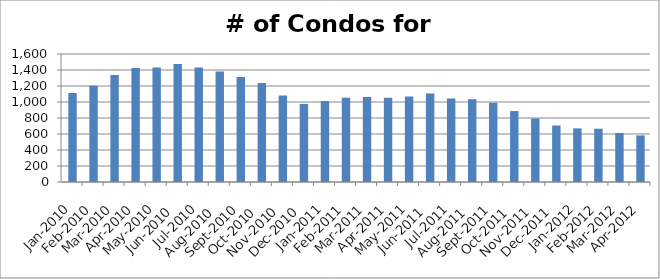
| Category | Series 0 |
|---|---|
| 2010-01-01 | 1111 |
| 2010-02-01 | 1203 |
| 2010-03-01 | 1337 |
| 2010-04-01 | 1425 |
| 2010-05-01 | 1431 |
| 2010-06-01 | 1475 |
| 2010-07-01 | 1432 |
| 2010-08-01 | 1380 |
| 2010-09-01 | 1314 |
| 2010-10-01 | 1236 |
| 2010-11-01 | 1081 |
| 2010-12-01 | 976 |
| 2011-01-01 | 1012 |
| 2011-02-01 | 1054 |
| 2011-03-01 | 1064 |
| 2011-04-01 | 1053 |
| 2011-05-01 | 1068 |
| 2011-06-01 | 1107 |
| 2011-07-01 | 1044 |
| 2011-08-01 | 1035 |
| 2011-09-01 | 990 |
| 2011-10-01 | 887 |
| 2011-11-01 | 794 |
| 2011-12-01 | 706 |
| 2012-01-01 | 670 |
| 2012-02-01 | 666 |
| 2012-03-01 | 612 |
| 2012-04-01 | 582 |